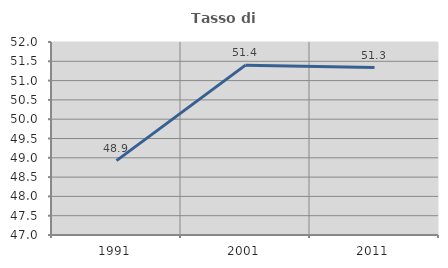
| Category | Tasso di occupazione   |
|---|---|
| 1991.0 | 48.926 |
| 2001.0 | 51.401 |
| 2011.0 | 51.338 |